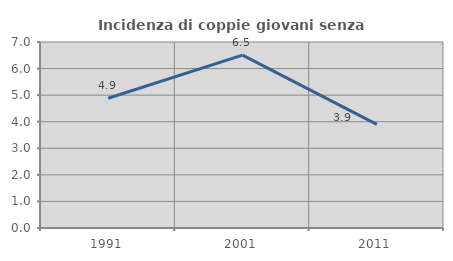
| Category | Incidenza di coppie giovani senza figli |
|---|---|
| 1991.0 | 4.882 |
| 2001.0 | 6.507 |
| 2011.0 | 3.897 |